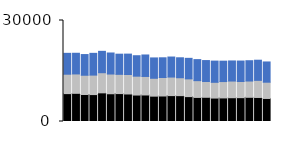
| Category | East Online | East Store | East Phone |
|---|---|---|---|
| 0 | 8282 | 5763 | 6203 |
| 1 | 8369 | 5757 | 6141 |
| 2 | 8024 | 5713 | 6147 |
| 3 | 7996 | 5783 | 6465 |
| 4 | 8513 | 5978 | 6349 |
| 5 | 8244 | 5857 | 6249 |
| 6 | 8293 | 5715 | 5988 |
| 7 | 8175 | 5777 | 6064 |
| 8 | 7858 | 5605 | 6076 |
| 9 | 7878 | 5499 | 6382 |
| 10 | 7531 | 5308 | 6045 |
| 11 | 7579 | 5482 | 5862 |
| 12 | 7692 | 5506 | 5953 |
| 13 | 7680 | 5319 | 5928 |
| 14 | 7392 | 5273 | 6095 |
| 15 | 7150 | 4983 | 6251 |
| 16 | 7193 | 4696 | 6211 |
| 17 | 6962 | 4675 | 6307 |
| 18 | 7002 | 4860 | 6059 |
| 19 | 7060 | 4955 | 5972 |
| 20 | 7083 | 4800 | 6074 |
| 21 | 7189 | 4831 | 6036 |
| 22 | 7140 | 5079 | 5986 |
| 23 | 6842 | 4829 | 6015 |